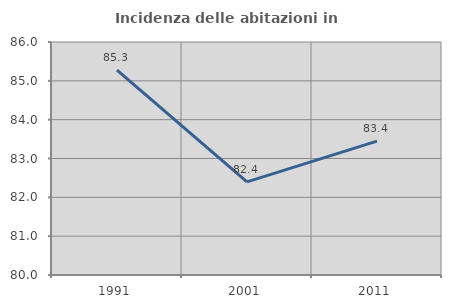
| Category | Incidenza delle abitazioni in proprietà  |
|---|---|
| 1991.0 | 85.279 |
| 2001.0 | 82.397 |
| 2011.0 | 83.446 |